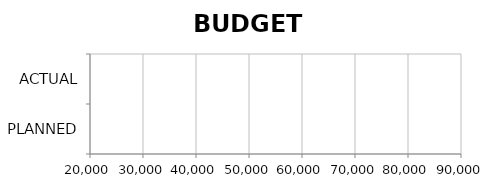
| Category | Series 0 |
|---|---|
| PLANNED | 0 |
| ACTUAL | 0 |